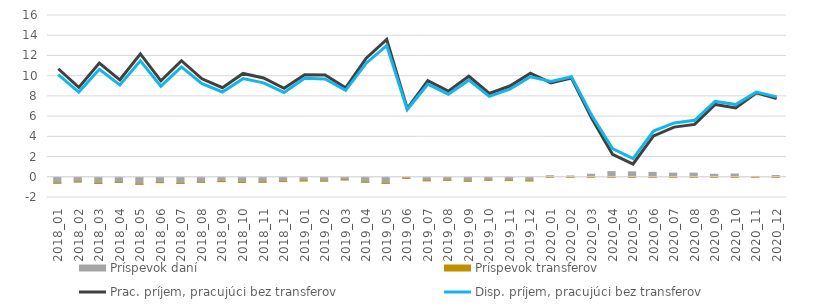
| Category | Príspevok daní | Príspevok transferov |
|---|---|---|
| 0 | -0.582 | -0.001 |
| 1 | -0.458 | -0.002 |
| 2 | -0.607 | -0.002 |
| 3 | -0.5 | -0.001 |
| 4 | -0.687 | -0.002 |
| 5 | -0.527 | -0.001 |
| 6 | -0.609 | -0.001 |
| 7 | -0.491 | -0.001 |
| 8 | -0.426 | -0.001 |
| 9 | -0.512 | -0.001 |
| 10 | -0.483 | -0.001 |
| 11 | -0.421 | -0.001 |
| 12 | -0.358 | -0.001 |
| 13 | -0.375 | -0.002 |
| 14 | -0.256 | -0.002 |
| 15 | -0.483 | -0.002 |
| 16 | -0.605 | -0.002 |
| 17 | -0.098 | -0.001 |
| 18 | -0.342 | -0.001 |
| 19 | -0.301 | -0.001 |
| 20 | -0.388 | -0.001 |
| 21 | -0.289 | -0.001 |
| 22 | -0.315 | -0.001 |
| 23 | -0.356 | -0.001 |
| 24 | 0.154 | 0 |
| 25 | 0.13 | 0 |
| 26 | 0.299 | -0.001 |
| 27 | 0.56 | 0 |
| 28 | 0.538 | 0 |
| 29 | 0.487 | 0 |
| 30 | 0.412 | 0 |
| 31 | 0.409 | 0 |
| 32 | 0.298 | 0 |
| 33 | 0.325 | 0 |
| 34 | 0.081 | 0 |
| 35 | 0.172 | 0 |